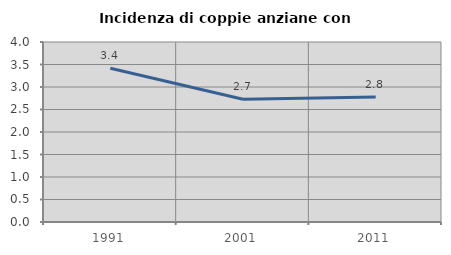
| Category | Incidenza di coppie anziane con figli |
|---|---|
| 1991.0 | 3.416 |
| 2001.0 | 2.727 |
| 2011.0 | 2.78 |